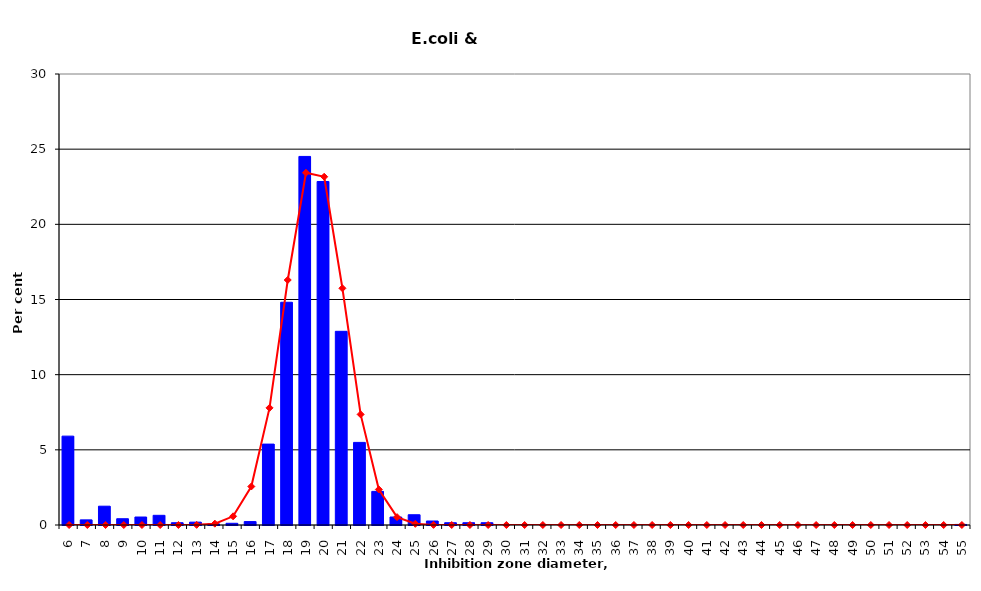
| Category | Per cent isolates |
|---|---|
| 0 | 5.911 |
| 1 | 0.341 |
| 2 | 1.25 |
| 3 | 0.417 |
| 4 | 0.531 |
| 5 | 0.644 |
| 6 | 0.152 |
| 7 | 0.189 |
| 8 | 0.076 |
| 9 | 0.114 |
| 10 | 0.227 |
| 11 | 5.381 |
| 12 | 14.816 |
| 13 | 24.517 |
| 14 | 22.85 |
| 15 | 12.884 |
| 16 | 5.495 |
| 17 | 2.236 |
| 18 | 0.531 |
| 19 | 0.682 |
| 20 | 0.265 |
| 21 | 0.152 |
| 22 | 0.152 |
| 23 | 0.152 |
| 24 | 0 |
| 25 | 0 |
| 26 | 0 |
| 27 | 0 |
| 28 | 0 |
| 29 | 0 |
| 30 | 0 |
| 31 | 0 |
| 32 | 0 |
| 33 | 0 |
| 34 | 0 |
| 35 | 0 |
| 36 | 0 |
| 37 | 0 |
| 38 | 0 |
| 39 | 0 |
| 40 | 0 |
| 41 | 0 |
| 42 | 0 |
| 43 | 0 |
| 44 | 0 |
| 45 | 0 |
| 46 | 0 |
| 47 | 0 |
| 48 | 0 |
| 49 | 0.038 |